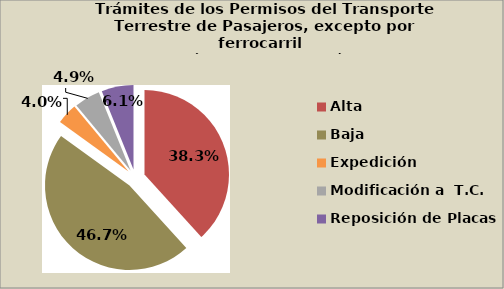
| Category | Series 0 |
|---|---|
| Alta                                         | 38.262 |
| Baja | 46.7 |
| Expedición | 3.98 |
| Modificación a  T.C. | 4.937 |
| Reposición de Placas | 6.121 |